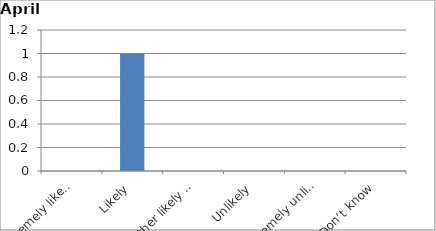
| Category | Series 0 |
|---|---|
| Extremely likely | 0 |
| Likely | 1 |
| Neither likely nor unlikely | 0 |
| Unlikely | 0 |
| Extremely unlikely | 0 |
| Don’t know | 0 |